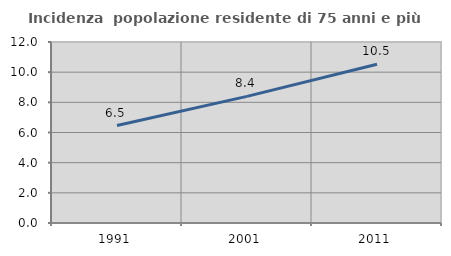
| Category | Incidenza  popolazione residente di 75 anni e più |
|---|---|
| 1991.0 | 6.464 |
| 2001.0 | 8.395 |
| 2011.0 | 10.525 |